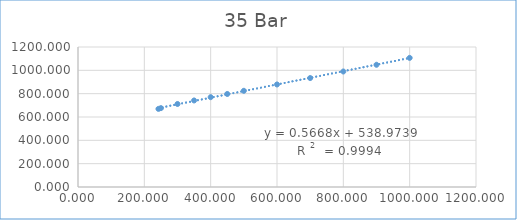
| Category | Series 0 |
|---|---|
| 242.6 | 669.517 |
| 250.0 | 675.991 |
| 300.0 | 711.515 |
| 350.0 | 741.71 |
| 400.0 | 769.995 |
| 450.0 | 797.42 |
| 500.0 | 824.558 |
| 600.0 | 878.858 |
| 700.0 | 933.899 |
| 800.0 | 990.11 |
| 900.0 | 1047.707 |
| 1000.0 | 1106.713 |